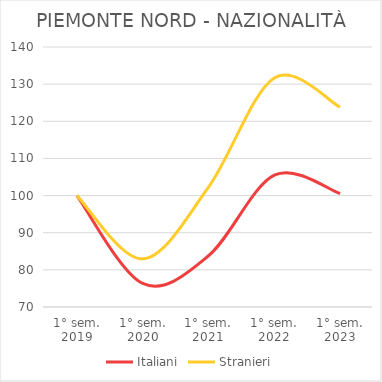
| Category | Italiani | Stranieri |
|---|---|---|
| 1° sem.
2019 | 100 | 100 |
| 1° sem.
2020 | 76.333 | 82.958 |
| 1° sem.
2021 | 83.791 | 102.251 |
| 1° sem.
2022 | 105.487 | 131.672 |
| 1° sem.
2023 | 100.541 | 123.794 |